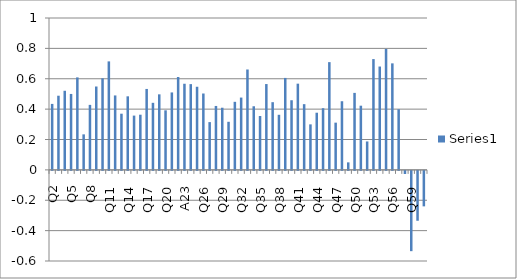
| Category | Series 0 |
|---|---|
| Q2 | 0.434 |
| Q3 | 0.488 |
| Q4 | 0.521 |
| Q5 | 0.5 |
| Q6 | 0.609 |
| Q7 | 0.234 |
| Q8 | 0.428 |
| Q9 | 0.549 |
| Q10 | 0.603 |
| Q11 | 0.714 |
| Q12 | 0.49 |
| Q13 | 0.37 |
| Q14 | 0.484 |
| Q15 | 0.357 |
| Q16 | 0.363 |
| Q17 | 0.533 |
| Q18 | 0.441 |
| Q19 | 0.497 |
| Q20 | 0.392 |
| Q21 | 0.51 |
| Q22 | 0.612 |
| A23 | 0.567 |
| Q24 | 0.565 |
| Q25 | 0.547 |
| Q26 | 0.503 |
| Q27 | 0.314 |
| Q28 | 0.421 |
| Q29 | 0.409 |
| Q30 | 0.317 |
| Q31 | 0.448 |
| Q32 | 0.476 |
| Q33 | 0.661 |
| Q34 | 0.419 |
| Q35 | 0.355 |
| Q36 | 0.565 |
| Q37 | 0.446 |
| Q38 | 0.363 |
| Q39 | 0.605 |
| Q40 | 0.459 |
| Q41 | 0.568 |
| Q42 | 0.433 |
| Q43 | 0.3 |
| Q44 | 0.376 |
| Q45 | 0.406 |
| Q46 | 0.709 |
| Q47 | 0.311 |
| Q48 | 0.452 |
| Q49 | 0.049 |
| Q50 | 0.507 |
| Q51 | 0.423 |
| Q52 | 0.187 |
| Q53 | 0.729 |
| Q54 | 0.68 |
| Q55 | 0.796 |
| Q56 | 0.701 |
| Q57 | 0.399 |
| Q58 | -0.021 |
| Q59 | -0.529 |
| Q60 | -0.328 |
| Q61 | -0.234 |